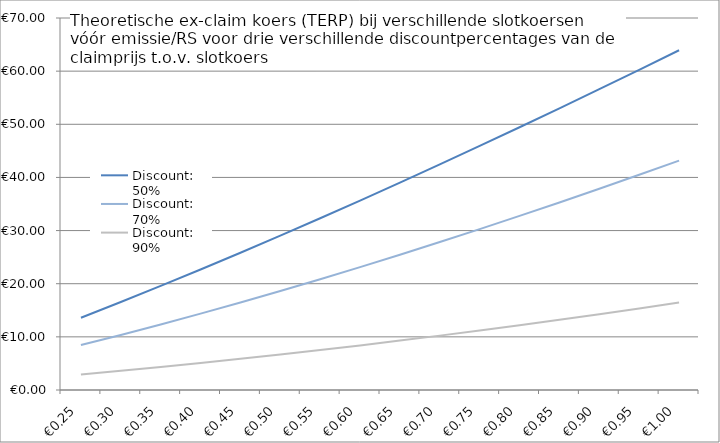
| Category | Discount: 50% | Discount: 70% | Discount: 90% |
|---|---|---|---|
| 0.25 | 13.601 | 8.458 | 2.926 |
| 0.3 | 16.558 | 10.365 | 3.612 |
| 0.35 | 19.584 | 12.338 | 4.329 |
| 0.4 | 22.677 | 14.376 | 5.079 |
| 0.45 | 25.832 | 16.475 | 5.861 |
| 0.5 | 29.047 | 18.635 | 6.674 |
| 0.55 | 32.319 | 20.853 | 7.518 |
| 0.6 | 35.645 | 23.128 | 8.392 |
| 0.65 | 39.023 | 25.457 | 9.297 |
| 0.7 | 42.45 | 27.84 | 10.232 |
| 0.75 | 45.924 | 30.275 | 11.197 |
| 0.8 | 49.443 | 32.759 | 12.191 |
| 0.85 | 53.005 | 35.293 | 13.214 |
| 0.9 | 56.609 | 37.874 | 14.266 |
| 0.95 | 60.252 | 40.5 | 15.346 |
| 1.0 | 63.933 | 43.172 | 16.455 |